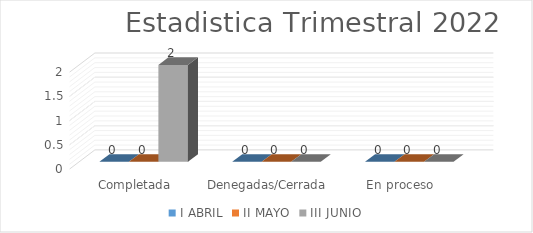
| Category | I | II | III |
|---|---|---|---|
| Completada | 0 | 0 | 2 |
| Denegadas/Cerrada | 0 | 0 | 0 |
| En proceso | 0 | 0 | 0 |